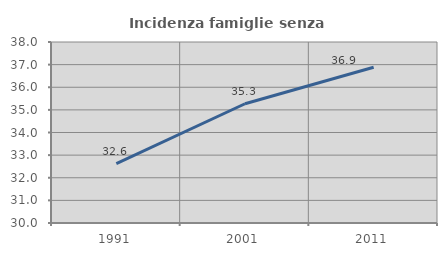
| Category | Incidenza famiglie senza nuclei |
|---|---|
| 1991.0 | 32.624 |
| 2001.0 | 35.271 |
| 2011.0 | 36.885 |